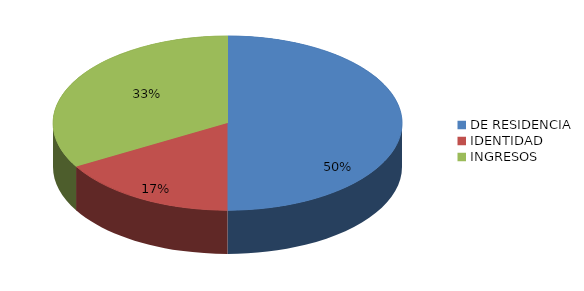
| Category | Series 0 |
|---|---|
| DE RESIDENCIA | 3 |
| IDENTIDAD | 1 |
| INGRESOS | 2 |